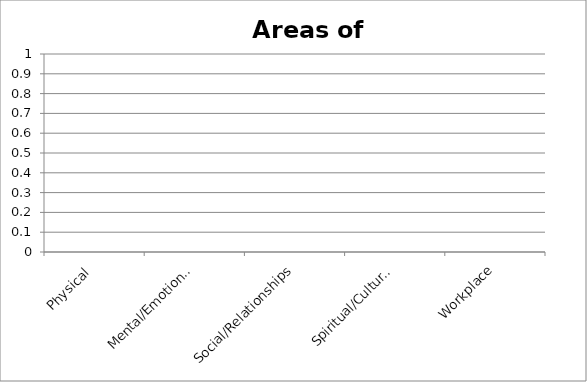
| Category | Wellness Chart |
|---|---|
| Physical | 0 |
| Mental/Emotional | 0 |
| Social/Relationships | 0 |
| Spiritual/Cultural | 0 |
| Workplace | 0 |